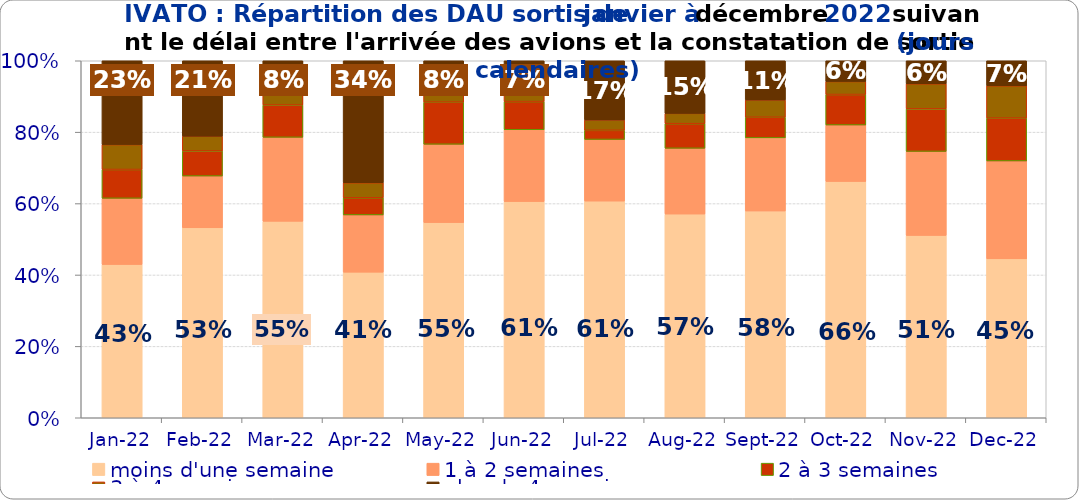
| Category | moins d'une semaine | 1 à 2 semaines | 2 à 3 semaines | 3 à 4 semaines | plus de 4 semaines |
|---|---|---|---|---|---|
| 2022-01-01 | 0.429 | 0.185 | 0.081 | 0.07 | 0.235 |
| 2022-02-01 | 0.532 | 0.145 | 0.07 | 0.041 | 0.211 |
| 2022-03-01 | 0.55 | 0.235 | 0.09 | 0.047 | 0.078 |
| 2022-04-01 | 0.408 | 0.16 | 0.048 | 0.042 | 0.342 |
| 2022-05-01 | 0.547 | 0.219 | 0.118 | 0.037 | 0.079 |
| 2022-06-01 | 0.606 | 0.201 | 0.079 | 0.043 | 0.071 |
| 2022-07-01 | 0.607 | 0.173 | 0.026 | 0.029 | 0.166 |
| 2022-08-01 | 0.571 | 0.184 | 0.069 | 0.029 | 0.147 |
| 2022-09-01 | 0.579 | 0.205 | 0.058 | 0.048 | 0.11 |
| 2022-10-01 | 0.662 | 0.158 | 0.085 | 0.036 | 0.058 |
| 2022-11-01 | 0.511 | 0.235 | 0.119 | 0.07 | 0.065 |
| 2022-12-01 | 0.445 | 0.274 | 0.12 | 0.091 | 0.07 |